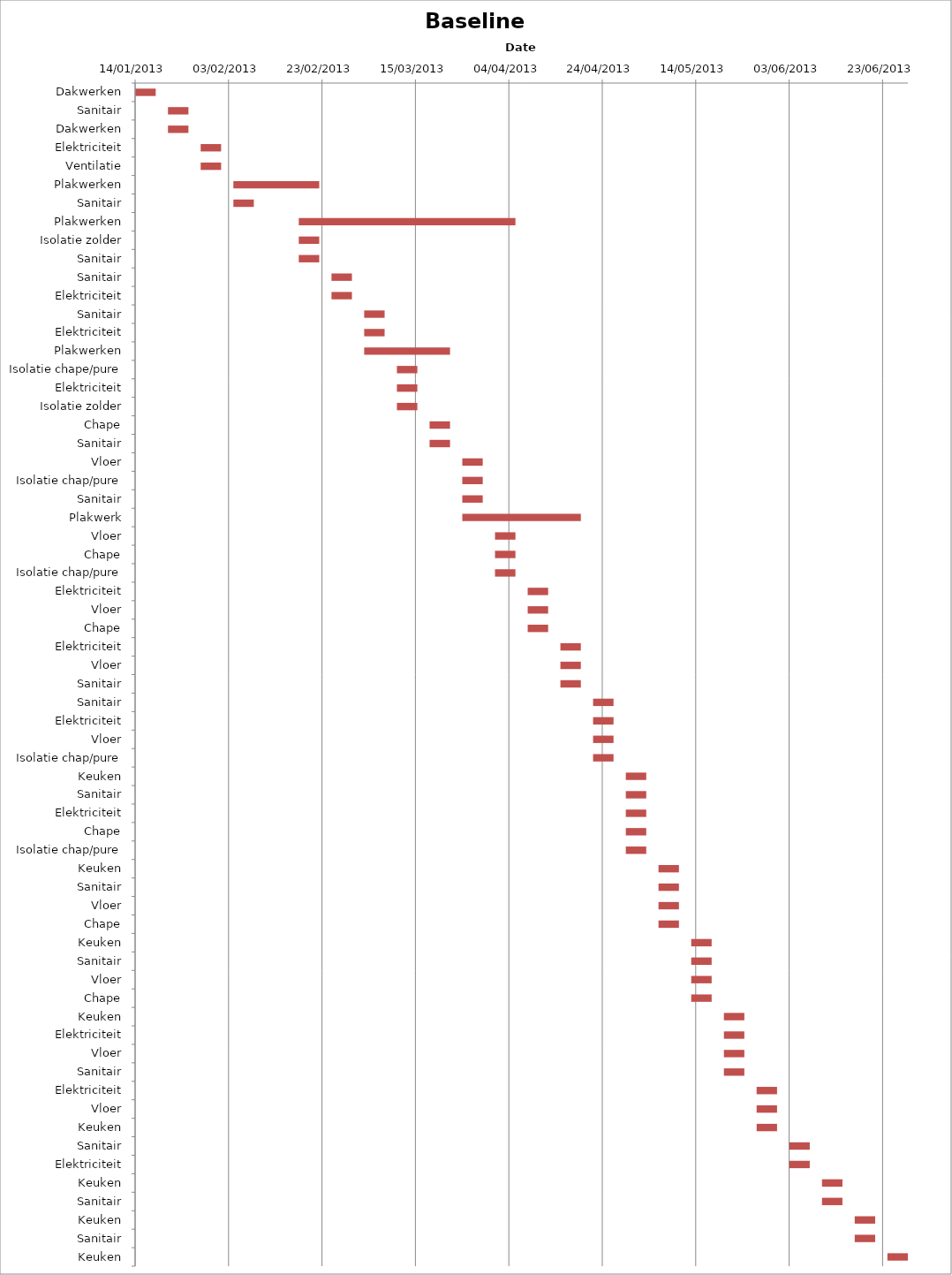
| Category | Baseline start | Actual duration |
|---|---|---|
| Dakwerken | 41288.333 | 4.375 |
| Sanitair | 41295.333 | 4.375 |
| Dakwerken | 41295.333 | 4.375 |
| Elektriciteit | 41302.333 | 4.375 |
| Ventilatie | 41302.333 | 4.375 |
| Plakwerken | 41309.333 | 18.375 |
| Sanitair | 41309.333 | 4.375 |
| Plakwerken | 41323.333 | 46.375 |
| Isolatie zolder | 41323.333 | 4.375 |
| Sanitair | 41323.333 | 4.375 |
| Sanitair | 41330.333 | 4.375 |
| Elektriciteit | 41330.333 | 4.375 |
| Sanitair | 41337.333 | 4.375 |
| Elektriciteit | 41337.333 | 4.375 |
| Plakwerken | 41337.333 | 18.375 |
| Isolatie chape/pure | 41344.333 | 4.375 |
| Elektriciteit | 41344.333 | 4.375 |
| Isolatie zolder | 41344.333 | 4.375 |
| Chape | 41351.333 | 4.375 |
| Sanitair | 41351.333 | 4.375 |
| Vloer | 41358.333 | 4.375 |
| Isolatie chap/pure | 41358.333 | 4.375 |
| Sanitair | 41358.333 | 4.375 |
| Plakwerk | 41358.333 | 25.375 |
| Vloer | 41365.333 | 4.375 |
| Chape | 41365.333 | 4.375 |
| Isolatie chap/pure | 41365.333 | 4.375 |
| Elektriciteit | 41372.333 | 4.375 |
| Vloer | 41372.333 | 4.375 |
| Chape | 41372.333 | 4.375 |
| Elektriciteit | 41379.333 | 4.375 |
| Vloer | 41379.333 | 4.375 |
| Sanitair | 41379.333 | 4.375 |
| Sanitair | 41386.333 | 4.375 |
| Elektriciteit | 41386.333 | 4.375 |
| Vloer | 41386.333 | 4.375 |
| Isolatie chap/pure | 41386.333 | 4.375 |
| Keuken | 41393.333 | 4.375 |
| Sanitair | 41393.333 | 4.375 |
| Elektriciteit | 41393.333 | 4.375 |
| Chape | 41393.333 | 4.375 |
| Isolatie chap/pure | 41393.333 | 4.375 |
| Keuken | 41400.333 | 4.375 |
| Sanitair | 41400.333 | 4.375 |
| Vloer | 41400.333 | 4.375 |
| Chape | 41400.333 | 4.375 |
| Keuken | 41407.333 | 4.375 |
| Sanitair | 41407.333 | 4.375 |
| Vloer | 41407.333 | 4.375 |
| Chape | 41407.333 | 4.375 |
| Keuken | 41414.333 | 4.375 |
| Elektriciteit | 41414.333 | 4.375 |
| Vloer | 41414.333 | 4.375 |
| Sanitair | 41414.333 | 4.375 |
| Elektriciteit | 41421.333 | 4.375 |
| Vloer | 41421.333 | 4.375 |
| Keuken | 41421.333 | 4.375 |
| Sanitair | 41428.333 | 4.375 |
| Elektriciteit | 41428.333 | 4.375 |
| Keuken | 41435.333 | 4.375 |
| Sanitair | 41435.333 | 4.375 |
| Keuken | 41442.333 | 4.375 |
| Sanitair | 41442.333 | 4.375 |
| Keuken | 41449.333 | 4.375 |